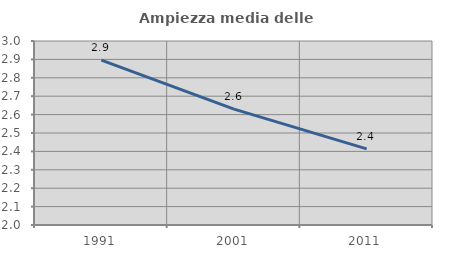
| Category | Ampiezza media delle famiglie |
|---|---|
| 1991.0 | 2.896 |
| 2001.0 | 2.63 |
| 2011.0 | 2.414 |